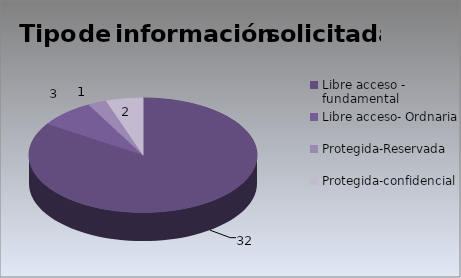
| Category | Series 0 |
|---|---|
| Libre acceso - fundamental | 32 |
| Libre acceso- Ordnaria | 3 |
| Protegida-Reservada | 1 |
| Protegida-confidencial | 2 |